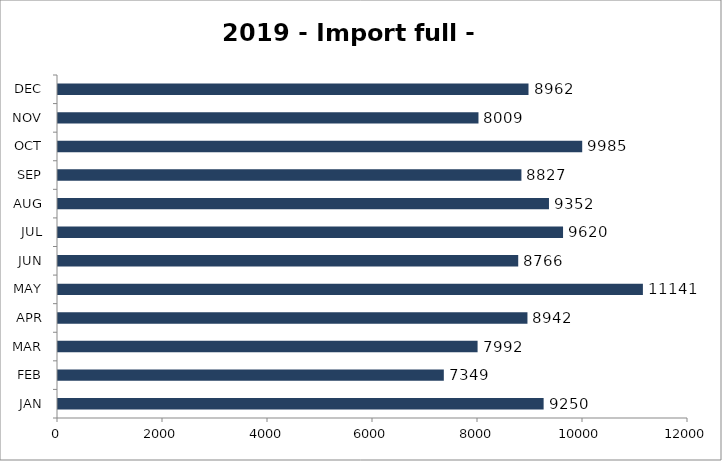
| Category | Import full - 20' |
|---|---|
| JAN | 9250 |
| FEB | 7349 |
| MAR | 7992 |
| APR | 8942 |
| MAY | 11141 |
| JUN | 8766 |
| JUL | 9620 |
| AUG | 9352 |
| SEP | 8827 |
| OCT | 9985 |
| NOV | 8009 |
| DEC | 8962 |